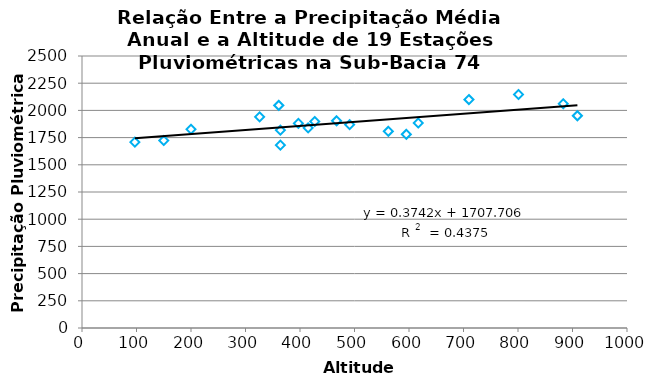
| Category | Series 0 |
|---|---|
| 200.0 | 1826.853 |
| 415.0 | 1839.43 |
| 883.0 | 2060.633 |
| 710.0 | 2099.767 |
| 361.0 | 2046 |
| 801.0 | 2146.498 |
| 909.0 | 1950.765 |
| 617.0 | 1884.44 |
| 427.0 | 1897.557 |
| 467.0 | 1904.04 |
| 364.0 | 1680.5 |
| 150.0 | 1722.858 |
| 491.0 | 1869.646 |
| 595.0 | 1779.97 |
| 326.0 | 1940.503 |
| 397.0 | 1880.763 |
| 364.0 | 1819.023 |
| 562.0 | 1807.447 |
| 97.0 | 1708.569 |